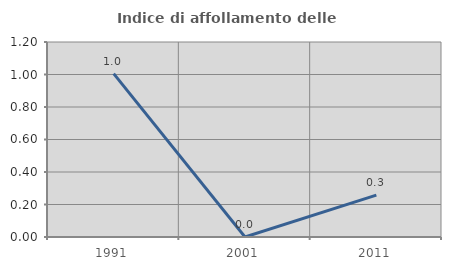
| Category | Indice di affollamento delle abitazioni  |
|---|---|
| 1991.0 | 1.005 |
| 2001.0 | 0 |
| 2011.0 | 0.258 |